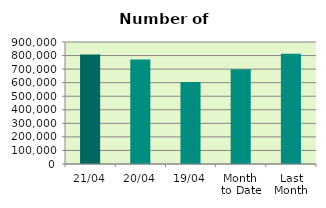
| Category | Series 0 |
|---|---|
| 21/04 | 808438 |
| 20/04 | 770672 |
| 19/04 | 604382 |
| Month 
to Date | 698585.231 |
| Last
Month | 813408 |